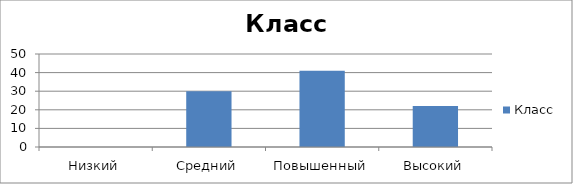
| Category | Класс |
|---|---|
| Низкий | 0 |
| Средний | 30 |
| Повышенный | 41 |
| Высокий | 22 |